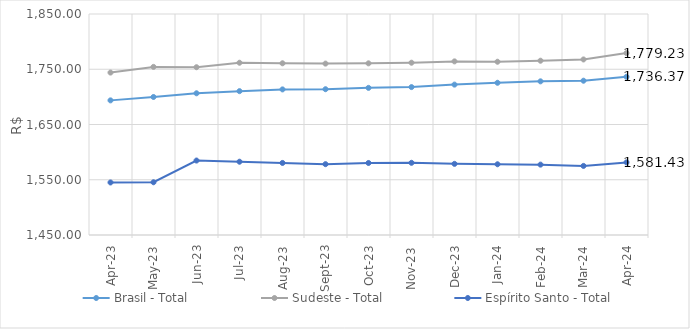
| Category | Brasil - Total | Sudeste - Total | Espírito Santo - Total |
|---|---|---|---|
| 2023-04-01 | 1693.67 | 1744 | 1545.09 |
| 2023-05-01 | 1699.79 | 1754.28 | 1545.47 |
| 2023-06-01 | 1706.5 | 1753.66 | 1584.76 |
| 2023-07-01 | 1710.37 | 1761.77 | 1582.65 |
| 2023-08-01 | 1713.52 | 1760.79 | 1580.42 |
| 2023-09-01 | 1713.87 | 1760.23 | 1578.2 |
| 2023-10-01 | 1716.3 | 1760.7 | 1580.35 |
| 2023-11-01 | 1717.71 | 1761.83 | 1580.67 |
| 2023-12-01 | 1722.19 | 1764.24 | 1578.77 |
| 2024-01-01 | 1725.52 | 1763.58 | 1578.04 |
| 2024-02-01 | 1728.11 | 1765.45 | 1577.37 |
| 2024-03-01 | 1729.25 | 1767.73 | 1575.03 |
| 2024-04-01 | 1736.37 | 1779.23 | 1581.43 |